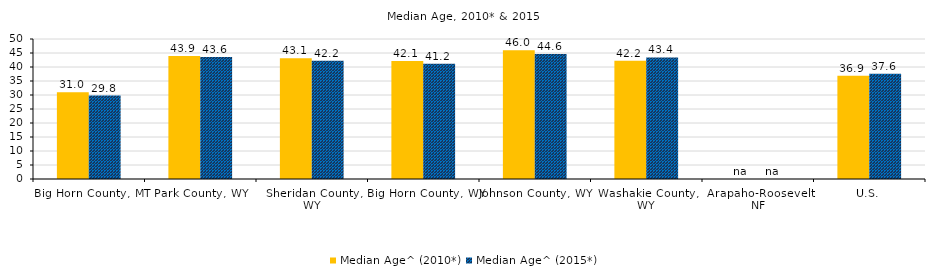
| Category | Median Age^ (2008*) | Median Age^ (2012*) |
|---|---|---|
| Gallatin County, MT | 31 | 32 |
| County Region | 0 | 0 |
| U.S. | 35.3 | 36.9 |